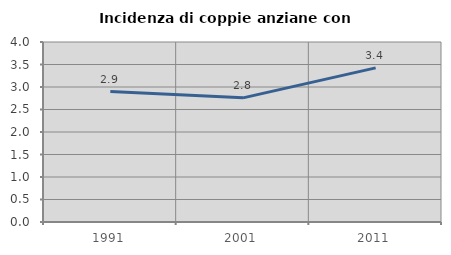
| Category | Incidenza di coppie anziane con figli |
|---|---|
| 1991.0 | 2.899 |
| 2001.0 | 2.759 |
| 2011.0 | 3.425 |